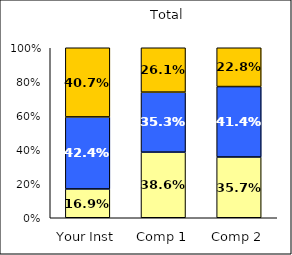
| Category | Low Diversity Climate | Average Diversity Climate | High Diversity Climate |
|---|---|---|---|
| Your Inst | 0.169 | 0.424 | 0.407 |
| Comp 1 | 0.386 | 0.353 | 0.261 |
| Comp 2 | 0.357 | 0.414 | 0.228 |